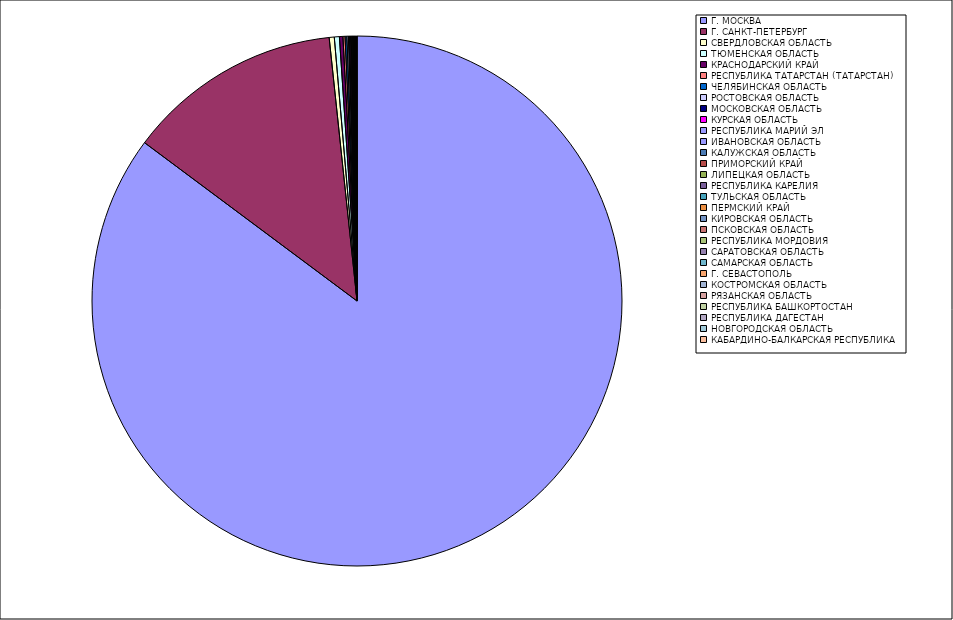
| Category | Оборот |
|---|---|
| Г. МОСКВА | 85.136 |
| Г. САНКТ-ПЕТЕРБУРГ | 13.122 |
| СВЕРДЛОВСКАЯ ОБЛАСТЬ | 0.309 |
| ТЮМЕНСКАЯ ОБЛАСТЬ | 0.308 |
| КРАСНОДАРСКИЙ КРАЙ | 0.213 |
| РЕСПУБЛИКА ТАТАРСТАН (ТАТАРСТАН) | 0.127 |
| ЧЕЛЯБИНСКАЯ ОБЛАСТЬ | 0.109 |
| РОСТОВСКАЯ ОБЛАСТЬ | 0.095 |
| МОСКОВСКАЯ ОБЛАСТЬ | 0.066 |
| КУРСКАЯ ОБЛАСТЬ | 0.06 |
| РЕСПУБЛИКА МАРИЙ ЭЛ | 0.042 |
| ИВАНОВСКАЯ ОБЛАСТЬ | 0.042 |
| КАЛУЖСКАЯ ОБЛАСТЬ | 0.041 |
| ПРИМОРСКИЙ КРАЙ | 0.033 |
| ЛИПЕЦКАЯ ОБЛАСТЬ | 0.027 |
| РЕСПУБЛИКА КАРЕЛИЯ | 0.023 |
| ТУЛЬСКАЯ ОБЛАСТЬ | 0.02 |
| ПЕРМСКИЙ КРАЙ | 0.017 |
| КИРОВСКАЯ ОБЛАСТЬ | 0.016 |
| ПСКОВСКАЯ ОБЛАСТЬ | 0.014 |
| РЕСПУБЛИКА МОРДОВИЯ | 0.014 |
| САРАТОВСКАЯ ОБЛАСТЬ | 0.013 |
| САМАРСКАЯ ОБЛАСТЬ | 0.013 |
| Г. СЕВАСТОПОЛЬ | 0.012 |
| КОСТРОМСКАЯ ОБЛАСТЬ | 0.011 |
| РЯЗАНСКАЯ ОБЛАСТЬ | 0.011 |
| РЕСПУБЛИКА БАШКОРТОСТАН | 0.01 |
| РЕСПУБЛИКА ДАГЕСТАН | 0.01 |
| НОВГОРОДСКАЯ ОБЛАСТЬ | 0.01 |
| КАБАРДИНО-БАЛКАРСКАЯ РЕСПУБЛИКА | 0.01 |